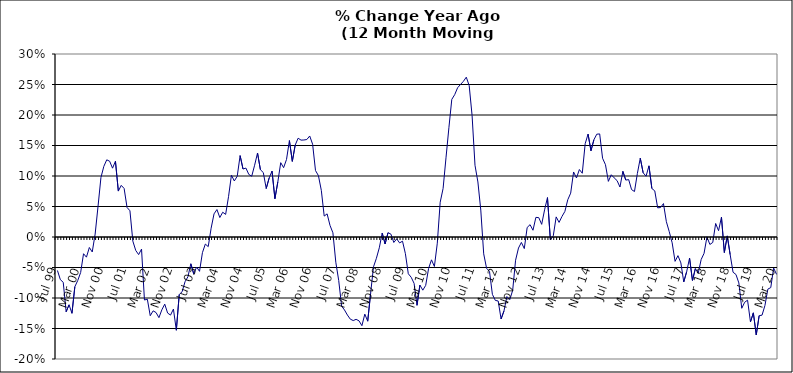
| Category | Series 0 |
|---|---|
| Jul 99 | -0.055 |
| Aug 99 | -0.07 |
| Sep 99 | -0.074 |
| Oct 99 | -0.123 |
| Nov 99 | -0.111 |
| Dec 99 | -0.125 |
| Jan 00 | -0.082 |
| Feb 00 | -0.071 |
| Mar 00 | -0.058 |
| Apr 00 | -0.027 |
| May 00 | -0.033 |
| Jun 00 | -0.017 |
| Jul 00 | -0.025 |
| Aug 00 | 0.005 |
| Sep 00 | 0.05 |
| Oct 00 | 0.098 |
| Nov 00 | 0.116 |
| Dec 00 | 0.127 |
| Jan 01 | 0.124 |
| Feb 01 | 0.113 |
| Mar 01 | 0.124 |
| Apr 01 | 0.075 |
| May 01 | 0.085 |
| Jun 01 | 0.08 |
| Jul 01 | 0.048 |
| Aug 01 | 0.043 |
| Sep 01 | -0.007 |
| Oct 01 | -0.022 |
| Nov 01 | -0.029 |
| Dec 01 | -0.02 |
| Jan 02 | -0.103 |
| Feb 02 | -0.102 |
| Mar 02 | -0.129 |
| Apr 02 | -0.121 |
| May 02 | -0.124 |
| Jun 02 | -0.132 |
| Jul 02 | -0.119 |
| Aug 02 | -0.11 |
| Sep 02 | -0.125 |
| Oct 02 | -0.128 |
| Nov 02 | -0.118 |
| Dec 02 | -0.153 |
| Jan 03 | -0.094 |
| Feb 03 | -0.09 |
| Mar 03 | -0.073 |
| Apr 03 | -0.065 |
| May 03 | -0.044 |
| Jun 03 | -0.06 |
| Jul 03 | -0.049 |
| Aug 03 | -0.056 |
| Sep 03 | -0.026 |
| Oct 03 | -0.012 |
| Nov 03 | -0.016 |
| Dec 03 | 0.014 |
| Jan 04 | 0.038 |
| Feb 04 | 0.045 |
| Mar 04 | 0.032 |
| Apr 04 | 0.041 |
| May 04 | 0.037 |
| Jun 04 | 0.066 |
| Jul 04 | 0.101 |
| Aug 04 | 0.092 |
| Sep 04 | 0.1 |
| Oct 04 | 0.133 |
| Nov 04 | 0.111 |
| Dec 04 | 0.113 |
| Jan 05 | 0.103 |
| Feb 05 | 0.1 |
| Mar 05 | 0.118 |
| Apr 05 | 0.138 |
| May 05 | 0.11 |
| Jun 05 | 0.106 |
| Jul 05 | 0.079 |
| Aug 05 | 0.097 |
| Sep 05 | 0.108 |
| Oct 05 | 0.063 |
| Nov 05 | 0.09 |
| Dec 05 | 0.122 |
| Jan 06 | 0.114 |
| Feb 06 | 0.127 |
| Mar 06 | 0.158 |
| Apr 06 | 0.124 |
| May 06 | 0.151 |
| Jun 06 | 0.162 |
| Jul 06 | 0.159 |
| Aug 06 | 0.159 |
| Sep 06 | 0.16 |
| Oct 06 | 0.166 |
| Nov 06 | 0.152 |
| Dec 06 | 0.109 |
| Jan 07 | 0.101 |
| Feb 07 | 0.076 |
| Mar 07 | 0.034 |
| Apr 07 | 0.038 |
| May 07 | 0.019 |
| Jun 07 | 0.007 |
| Jul 07 | -0.041 |
| Aug 07 | -0.071 |
| Sep 07 | -0.113 |
| Oct 07 | -0.12 |
| Nov 07 | -0.128 |
| Dec 07 | -0.135 |
| Jan 08 | -0.137 |
| Feb 08 | -0.135 |
| Mar 08 | -0.137 |
| Apr 08 | -0.145 |
| May 08 | -0.126 |
| Jun 08 | -0.138 |
| Jul 08 | -0.093 |
| Aug 08 | -0.049 |
| Sep-08 | -0.035 |
| Oct 08 | -0.018 |
| Nov 08 | 0.007 |
| Dec 08 | -0.011 |
| Jan 09 | 0.007 |
| Feb 09 | 0.005 |
| Mar 09 | -0.009 |
| Apr 09 | -0.003 |
| May 09 | -0.01 |
| Jun 09 | -0.007 |
| Jul 09 | -0.027 |
| Aug 09 | -0.06 |
| Sep 09 | -0.066 |
| Oct 09 | -0.076 |
| Nov 09 | -0.112 |
| Dec 09 | -0.079 |
| Jan 10 | -0.087 |
| Feb 10 | -0.079 |
| Mar 10 | -0.052 |
| Apr 10 | -0.037 |
| May 10 | -0.048 |
| Jun 10 | -0.01 |
| Jul 10 | 0.057 |
| Aug 10 | 0.08 |
| Sep 10 | 0.13 |
| Oct 10 | 0.179 |
| Nov 10 | 0.226 |
| Dec 10 | 0.233 |
| Jan 11 | 0.245 |
| Feb 11 | 0.25 |
| Mar 11 | 0.255 |
| Apr 11 | 0.262 |
| May 11 | 0.248 |
| Jun 11 | 0.199 |
| Jul 11 | 0.118 |
| Aug 11 | 0.09 |
| Sep 11 | 0.044 |
| Oct 11 | -0.028 |
| Nov 11 | -0.051 |
| Dec 11 | -0.056 |
| Jan 12 | -0.094 |
| Feb 12 | -0.104 |
| Mar 12 | -0.105 |
| Apr 12 | -0.134 |
| May 12 | -0.121 |
| Jun 12 | -0.098 |
| Jul 12 | -0.103 |
| Aug 12 | -0.087 |
| Sep 12 | -0.038 |
| Oct 12 | -0.018 |
| Nov 12 | -0.009 |
| Dec 12 | -0.019 |
| Jan 13 | 0.016 |
| Feb-13 | 0.02 |
| Mar-13 | 0.011 |
| Apr 13 | 0.032 |
| May 13 | 0.032 |
| Jun-13 | 0.021 |
| Jul 13 | 0.045 |
| Aug 13 | 0.065 |
| Sep 13 | -0.005 |
| Oct 13 | 0.002 |
| Nov 13 | 0.033 |
| Dec 13 | 0.024 |
| Jan 14 | 0.034 |
| Feb-14 | 0.042 |
| Mar 14 | 0.061 |
| Apr 14 | 0.072 |
| May 14 | 0.107 |
| Jun 14 | 0.097 |
| Jul-14 | 0.111 |
| Aug-14 | 0.105 |
| Sep 14 | 0.153 |
| Oct 14 | 0.169 |
| Nov 14 | 0.141 |
| Dec 14 | 0.159 |
| Jan 15 | 0.169 |
| Feb 15 | 0.169 |
| Mar 15 | 0.129 |
| Apr-15 | 0.118 |
| May 15 | 0.091 |
| Jun-15 | 0.102 |
| Jul 15 | 0.097 |
| Aug 15 | 0.092 |
| Sep 15 | 0.082 |
| Oct 15 | 0.108 |
| Nov 15 | 0.093 |
| Dec 15 | 0.094 |
| Jan 16 | 0.078 |
| Feb 16 | 0.075 |
| Mar 16 | 0.104 |
| Apr 16 | 0.129 |
| May 16 | 0.105 |
| Jun 16 | 0.1 |
| Jul 16 | 0.117 |
| Aug 16 | 0.08 |
| Sep 16 | 0.076 |
| Oct 16 | 0.048 |
| Nov 16 | 0.048 |
| Dec 16 | 0.055 |
| Jan 17 | 0.025 |
| Feb 17 | 0.009 |
| Mar 17 | -0.01 |
| Apr 17 | -0.04 |
| May 17 | -0.031 |
| Jun 17 | -0.042 |
| Jul 17 | -0.074 |
| Aug 17 | -0.057 |
| Sep 17 | -0.035 |
| Oct 17 | -0.071 |
| Nov 17 | -0.052 |
| Dec 17 | -0.059 |
| Jan 18 | -0.037 |
| Feb 18 | -0.027 |
| Mar 18 | 0 |
| Apr 18 | -0.012 |
| May 18 | -0.009 |
| Jun 18 | 0.022 |
| Jul 18 | 0.01 |
| Aug 18 | 0.033 |
| Sep 18 | -0.025 |
| Oct 18 | 0.002 |
| Nov 18 | -0.029 |
| Dec 18 | -0.058 |
| Jan 19 | -0.061 |
| Feb 19 | -0.075 |
| Mar 19 | -0.117 |
| Apr 19 | -0.107 |
| May 19 | -0.104 |
| Jun 19 | -0.139 |
| Jul 19 | -0.124 |
| Aug 19 | -0.16 |
| Sep 19 | -0.129 |
| Oct 19 | -0.128 |
| Nov 19 | -0.112 |
| Dec 19 | -0.085 |
| Jan 20 | -0.083 |
| Feb 20 | -0.051 |
| Mar 20 | -0.061 |